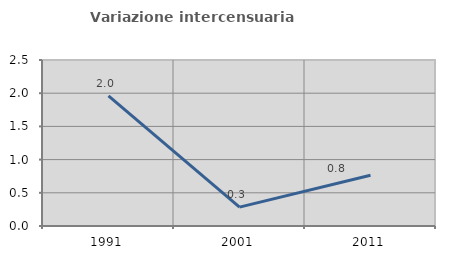
| Category | Variazione intercensuaria annua |
|---|---|
| 1991.0 | 1.959 |
| 2001.0 | 0.284 |
| 2011.0 | 0.766 |